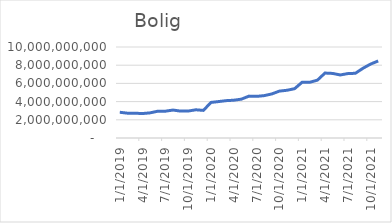
| Category | Bolig |
|---|---|
| 1/1/19 | 2825579583.333 |
| 2/1/19 | 2728292083.333 |
| 3/1/19 | 2721046666.667 |
| 4/1/19 | 2688566666.667 |
| 5/1/19 | 2763704166.667 |
| 6/1/19 | 2945462500 |
| 7/1/19 | 2946545833.333 |
| 8/1/19 | 3070425000 |
| 9/1/19 | 2955191666.667 |
| 10/1/19 | 2961379166.667 |
| 11/1/19 | 3100229166.667 |
| 12/1/19 | 3034916666.667 |
| 1/1/20 | 3909233333.333 |
| 2/1/20 | 4003633333.333 |
| 3/1/20 | 4105116666.667 |
| 4/1/20 | 4151583333.333 |
| 5/1/20 | 4269500000 |
| 6/1/20 | 4602608333.333 |
| 7/1/20 | 4574316666.667 |
| 8/1/20 | 4657254166.667 |
| 9/1/20 | 4842050000 |
| 10/1/20 | 5152925000 |
| 11/1/20 | 5245325000 |
| 12/1/20 | 5419241666.667 |
| 1/1/21 | 6135087500 |
| 2/1/21 | 6124045833.333 |
| 3/1/21 | 6355562500 |
| 4/1/21 | 7136812500 |
| 5/1/21 | 7095729166.667 |
| 6/1/21 | 6927212500 |
| 7/1/21 | 7077337500 |
| 8/1/21 | 7111959166.667 |
| 9/1/21 | 7663330000 |
| 10/1/21 | 8124121666.667 |
| 11/1/21 | 8466846666.667 |